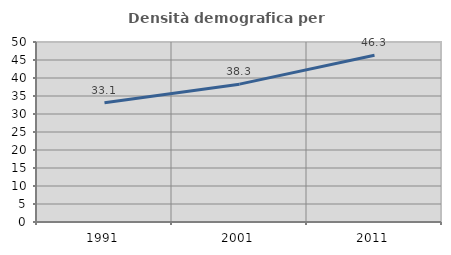
| Category | Densità demografica |
|---|---|
| 1991.0 | 33.101 |
| 2001.0 | 38.294 |
| 2011.0 | 46.313 |